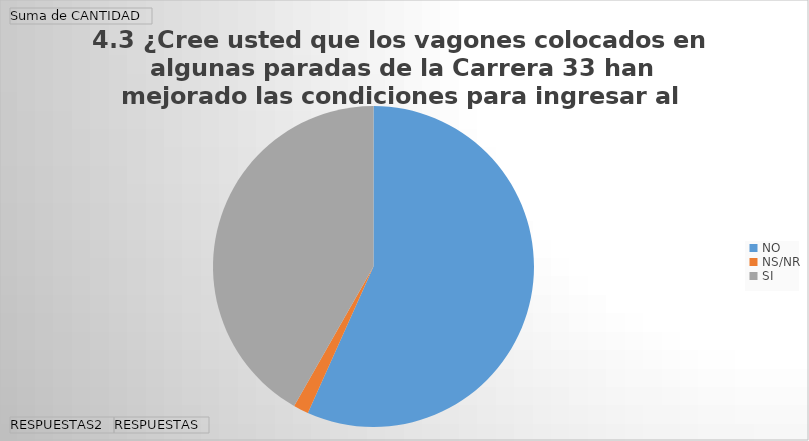
| Category | Total |
|---|---|
| NO | 186 |
| NS/NR | 5 |
| SI | 137 |